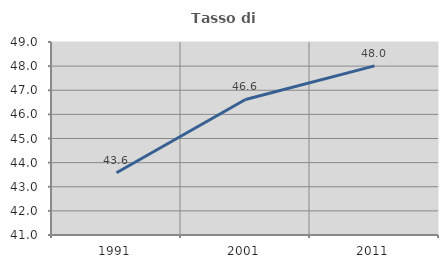
| Category | Tasso di occupazione   |
|---|---|
| 1991.0 | 43.58 |
| 2001.0 | 46.617 |
| 2011.0 | 48.009 |